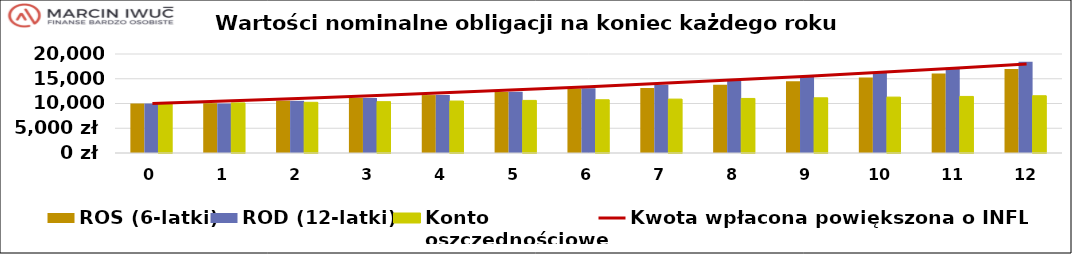
| Category | ROS (6-latki) | ROD (12-latki)  | Konto
oszczędnościowe |
|---|---|---|---|
| 0.0 | 10000 | 10000 | 10000 |
| 1.0 | 10064.8 | 10000 | 10122.179 |
| 2.0 | 10578.644 | 10537.03 | 10245.851 |
| 3.0 | 11124.603 | 11108.967 | 10371.033 |
| 4.0 | 11704.684 | 11718.08 | 10497.745 |
| 5.0 | 12321.021 | 12366.785 | 10626.006 |
| 6.0 | 13032.578 | 13057.656 | 10755.833 |
| 7.0 | 13117.216 | 13793.434 | 10887.247 |
| 8.0 | 13785.616 | 14577.037 | 11020.266 |
| 9.0 | 14495.771 | 15411.574 | 11154.91 |
| 10.0 | 15250.289 | 16300.357 | 11291.2 |
| 11.0 | 16051.944 | 17246.91 | 11429.154 |
| 12.0 | 16977.392 | 18416.989 | 11568.794 |